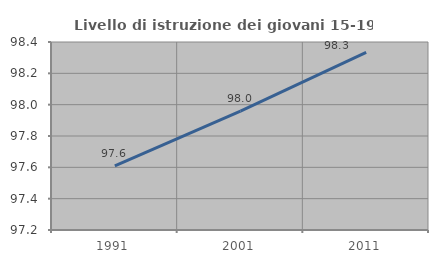
| Category | Livello di istruzione dei giovani 15-19 anni |
|---|---|
| 1991.0 | 97.61 |
| 2001.0 | 97.959 |
| 2011.0 | 98.333 |